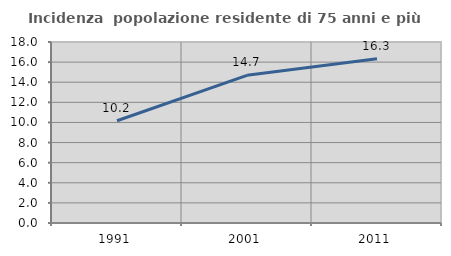
| Category | Incidenza  popolazione residente di 75 anni e più |
|---|---|
| 1991.0 | 10.169 |
| 2001.0 | 14.685 |
| 2011.0 | 16.332 |